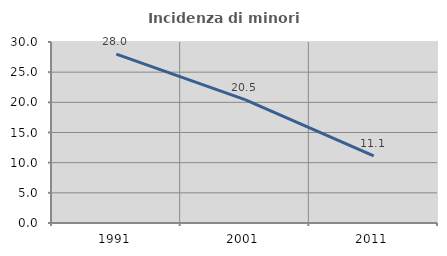
| Category | Incidenza di minori stranieri |
|---|---|
| 1991.0 | 28 |
| 2001.0 | 20.455 |
| 2011.0 | 11.111 |